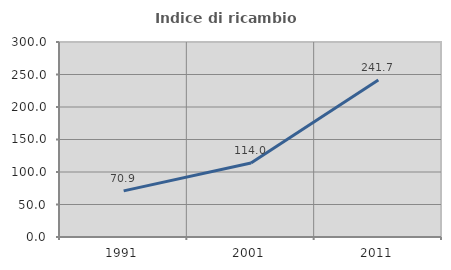
| Category | Indice di ricambio occupazionale  |
|---|---|
| 1991.0 | 70.919 |
| 2001.0 | 113.984 |
| 2011.0 | 241.693 |